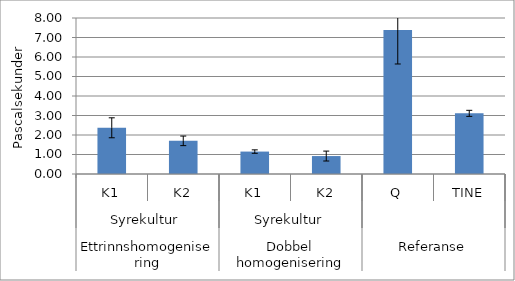
| Category | Series 0 |
|---|---|
| 0 | 2.37 |
| 1 | 1.7 |
| 2 | 1.15 |
| 3 | 0.92 |
| 4 | 7.39 |
| 5 | 3.11 |